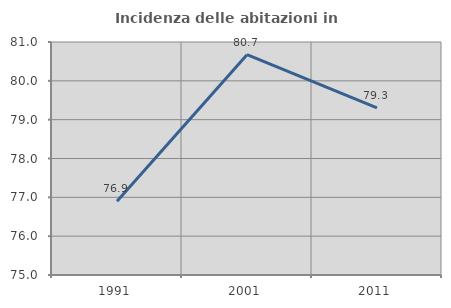
| Category | Incidenza delle abitazioni in proprietà  |
|---|---|
| 1991.0 | 76.897 |
| 2001.0 | 80.673 |
| 2011.0 | 79.303 |